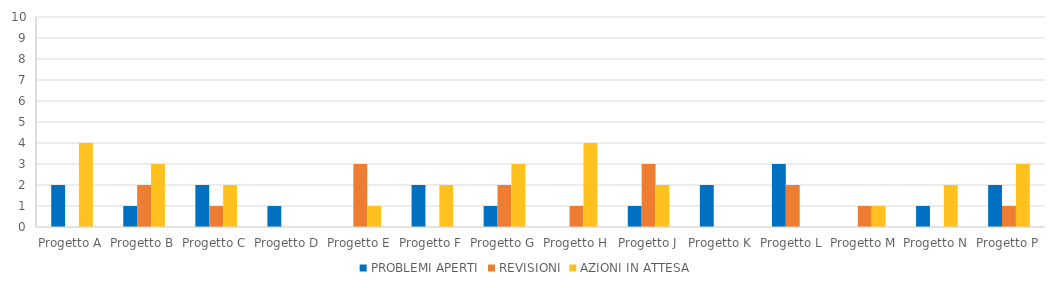
| Category | PROBLEMI APERTI | REVISIONI | AZIONI IN ATTESA |
|---|---|---|---|
| Progetto A | 2 | 0 | 4 |
| Progetto B | 1 | 2 | 3 |
| Progetto C | 2 | 1 | 2 |
| Progetto D | 1 | 0 | 0 |
| Progetto E | 0 | 3 | 1 |
| Progetto F | 2 | 0 | 2 |
| Progetto G | 1 | 2 | 3 |
| Progetto H | 0 | 1 | 4 |
| Progetto J | 1 | 3 | 2 |
| Progetto K | 2 | 0 | 0 |
| Progetto L | 3 | 2 | 0 |
| Progetto M | 0 | 1 | 1 |
| Progetto N | 1 | 0 | 2 |
| Progetto P | 2 | 1 | 3 |